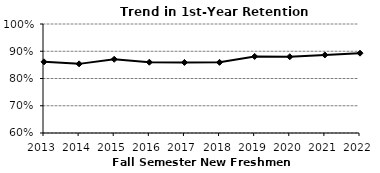
| Category | Series 1 |
|---|---|
| 2013.0 | 0.861 |
| 2014.0 | 0.854 |
| 2015.0 | 0.871 |
| 2016.0 | 0.86 |
| 2017.0 | 0.859 |
| 2018.0 | 0.859 |
| 2019.0 | 0.881 |
| 2020.0 | 0.88 |
| 2021.0 | 0.886 |
| 2022.0 | 0.893 |